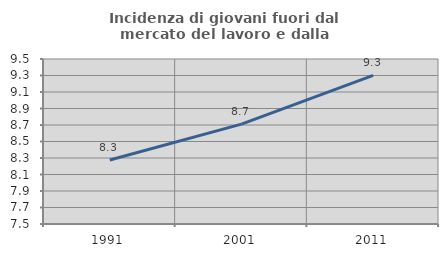
| Category | Incidenza di giovani fuori dal mercato del lavoro e dalla formazione  |
|---|---|
| 1991.0 | 8.276 |
| 2001.0 | 8.711 |
| 2011.0 | 9.302 |